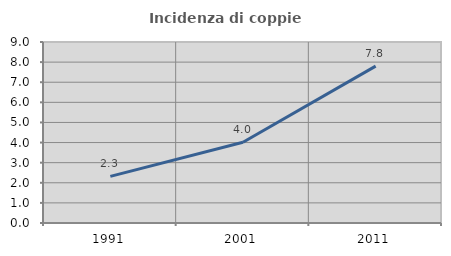
| Category | Incidenza di coppie miste |
|---|---|
| 1991.0 | 2.317 |
| 2001.0 | 4.016 |
| 2011.0 | 7.798 |